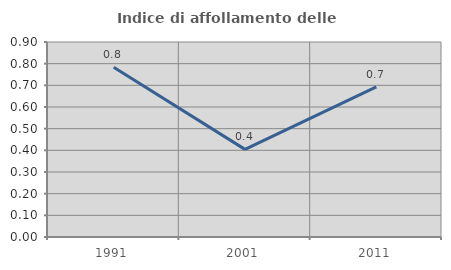
| Category | Indice di affollamento delle abitazioni  |
|---|---|
| 1991.0 | 0.784 |
| 2001.0 | 0.404 |
| 2011.0 | 0.693 |